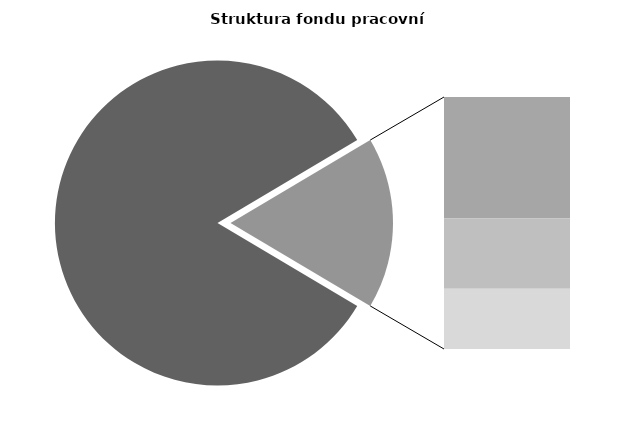
| Category | Series 0 |
|---|---|
| Průměrná měsíční odpracovaná doba bez přesčasu | 141.329 |
| Dovolená | 13.97 |
| Nemoc | 8.146 |
| Jiné | 6.939 |